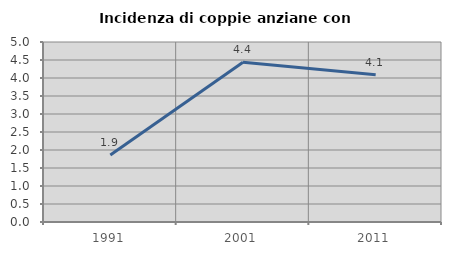
| Category | Incidenza di coppie anziane con figli |
|---|---|
| 1991.0 | 1.863 |
| 2001.0 | 4.438 |
| 2011.0 | 4.091 |